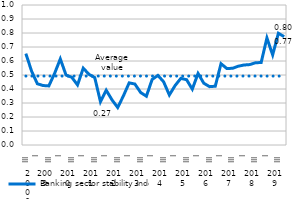
| Category | Banking sector stability index | Average value |
|---|---|---|
| 0 | 0.653 | 0.492 |
| 1 | 0.527 | 0.492 |
| 2 | 0.438 | 0.492 |
| 3 | 0.425 | 0.492 |
| 4 | 0.422 | 0.492 |
| 5 | 0.511 | 0.492 |
| 6 | 0.615 | 0.492 |
| 7 | 0.499 | 0.492 |
| 8 | 0.484 | 0.492 |
| 9 | 0.429 | 0.492 |
| 10 | 0.549 | 0.492 |
| 11 | 0.505 | 0.492 |
| 12 | 0.482 | 0.492 |
| 13 | 0.309 | 0.492 |
| 14 | 0.391 | 0.492 |
| 15 | 0.323 | 0.492 |
| 16 | 0.268 | 0.492 |
| 17 | 0.351 | 0.492 |
| 18 | 0.444 | 0.492 |
| 19 | 0.435 | 0.492 |
| 20 | 0.375 | 0.492 |
| 21 | 0.349 | 0.492 |
| 22 | 0.468 | 0.492 |
| 23 | 0.497 | 0.492 |
| 24 | 0.452 | 0.492 |
| 25 | 0.357 | 0.492 |
| 26 | 0.425 | 0.492 |
| 27 | 0.476 | 0.492 |
| 28 | 0.467 | 0.492 |
| 29 | 0.399 | 0.492 |
| 30 | 0.511 | 0.492 |
| 31 | 0.442 | 0.492 |
| 32 | 0.417 | 0.492 |
| 33 | 0.42 | 0.492 |
| 34 | 0.581 | 0.492 |
| 35 | 0.547 | 0.492 |
| 36 | 0.548 | 0.492 |
| 37 | 0.563 | 0.492 |
| 38 | 0.571 | 0.492 |
| 39 | 0.574 | 0.492 |
| 40 | 0.587 | 0.492 |
| 41 | 0.589 | 0.492 |
| 42 | 0.765 | 0.492 |
| 43 | 0.643 | 0.492 |
| 44 | 0.798 | 0.492 |
| 45 | 0.774 | 0.492 |